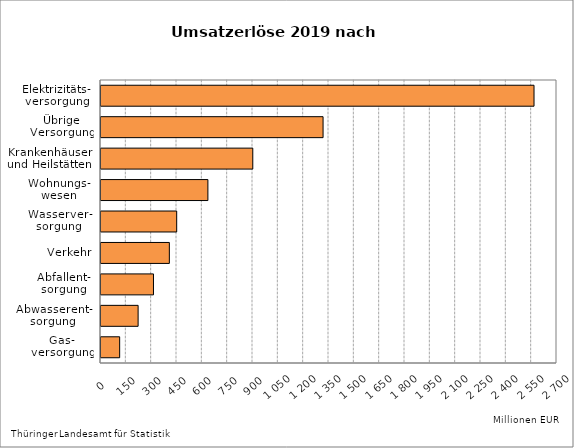
| Category | Series 1 |
|---|---|
| Gas-
versorgung | 110.485 |
| Abwasserent-
sorgung | 219.78 |
| Abfallent-
sorgung | 310.755 |
| Verkehr | 404.706 |
| Wasserver-
sorgung | 448.197 |
| Wohnungs-
wesen | 632.907 |
| Krankenhäuser
und Heilstätten | 898.767 |
| Übrige
Versorgung | 1314.905 |
| Elektrizitäts-
versorgung | 2563.991 |